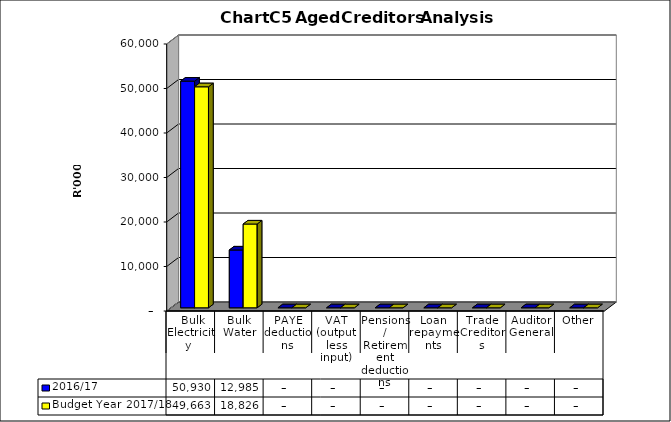
| Category | 2016/17 | Budget Year 2017/18 |
|---|---|---|
|  Bulk Electricity  | 50930424.87 | 49662951 |
| Bulk Water | 12985459.97 | 18826099 |
| PAYE deductions | 0 | 0 |
| VAT (output less input) | 0 | 0 |
| Pensions / Retirement deductions | 0 | 0 |
| Loan repayments | 0 | 0 |
| Trade Creditors | 0 | 0 |
| Auditor General | 0 | 0 |
| Other | 0 | 0 |